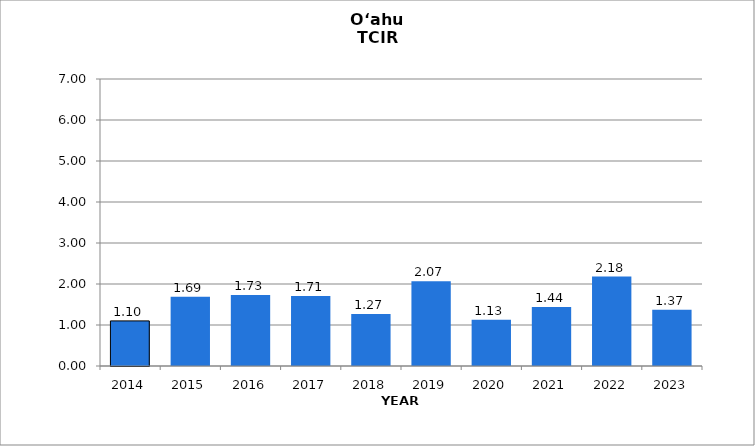
| Category | O‘ahu |
|---|---|
| 2014.0 | 1.1 |
| 2015.0 | 1.69 |
| 2016.0 | 1.73 |
| 2017.0 | 1.71 |
| 2018.0 | 1.27 |
| 2019.0 | 2.07 |
| 2020.0 | 1.13 |
| 2021.0 | 1.44 |
| 2022.0 | 2.18 |
| 2023.0 | 1.37 |